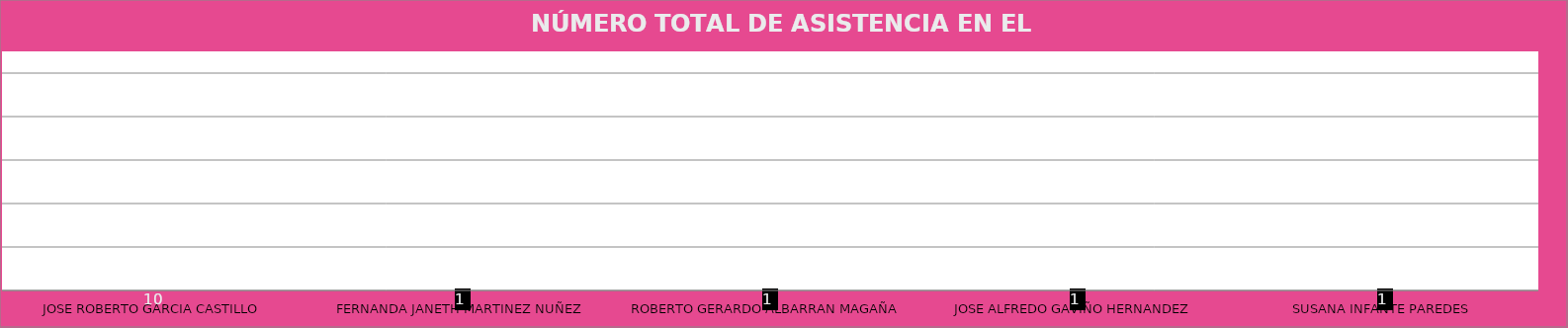
| Category | JOSE ROBERTO GARCIA CASTILLO |
|---|---|
| JOSE ROBERTO GARCIA CASTILLO | 1 |
| FERNANDA JANETH MARTINEZ NUÑEZ | 1 |
| ROBERTO GERARDO ALBARRAN MAGAÑA | 1 |
| JOSE ALFREDO GAVIÑO HERNANDEZ | 1 |
| SUSANA INFANTE PAREDES | 1 |